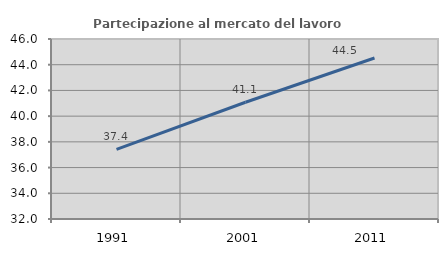
| Category | Partecipazione al mercato del lavoro  femminile |
|---|---|
| 1991.0 | 37.411 |
| 2001.0 | 41.082 |
| 2011.0 | 44.524 |